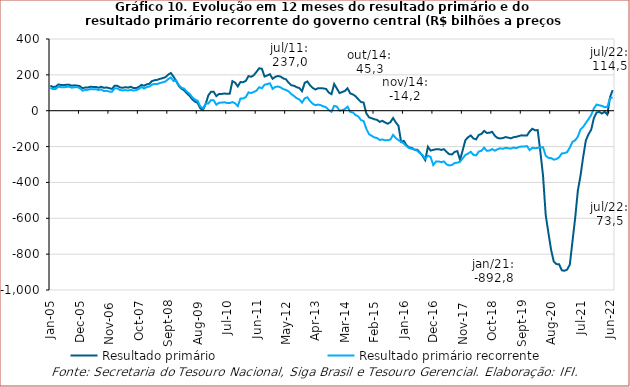
| Category | Resultado primário | Resultado primário recorrente |
|---|---|---|
| 2005-01-01 | 139436.817 | 127673.779 |
| 2005-02-01 | 132611.964 | 120337.511 |
| 2005-03-01 | 133649.316 | 121381.507 |
| 2005-04-01 | 146688.731 | 134319.81 |
| 2005-05-01 | 143333.996 | 131042.146 |
| 2005-06-01 | 142542.541 | 130485.238 |
| 2005-07-01 | 144862.796 | 132820.292 |
| 2005-08-01 | 145155.501 | 134461.936 |
| 2005-09-01 | 139491.511 | 128444.129 |
| 2005-10-01 | 141557.367 | 130928.578 |
| 2005-11-01 | 140064.192 | 131908.505 |
| 2005-12-01 | 137344.642 | 125599.415 |
| 2006-01-01 | 125276.586 | 111679.353 |
| 2006-02-01 | 128983.829 | 115694.97 |
| 2006-03-01 | 129899.632 | 116690.653 |
| 2006-04-01 | 133341.775 | 120479.767 |
| 2006-05-01 | 132758.24 | 120009.68 |
| 2006-06-01 | 132887.423 | 120169.295 |
| 2006-07-01 | 128116.796 | 115333.181 |
| 2006-08-01 | 133942.112 | 119059.597 |
| 2006-09-01 | 127707.337 | 109500.976 |
| 2006-10-01 | 129699.626 | 111447.923 |
| 2006-11-01 | 125626.39 | 106721.613 |
| 2006-12-01 | 121567.73 | 105532.153 |
| 2007-01-01 | 139584.171 | 125148.093 |
| 2007-02-01 | 139056.412 | 124365.782 |
| 2007-03-01 | 130238.918 | 115585.478 |
| 2007-04-01 | 127749.047 | 113198.091 |
| 2007-05-01 | 131350.507 | 115025.716 |
| 2007-06-01 | 128767.824 | 112399.778 |
| 2007-07-01 | 133613.732 | 116794.713 |
| 2007-08-01 | 126768.612 | 112461.109 |
| 2007-09-01 | 125929.982 | 114389.009 |
| 2007-10-01 | 132447.26 | 120627.635 |
| 2007-11-01 | 143927.598 | 132536.48 |
| 2007-12-01 | 139223.904 | 123838.266 |
| 2008-01-01 | 146879.624 | 131829.517 |
| 2008-02-01 | 150495.553 | 135152.38 |
| 2008-03-01 | 165662.895 | 145600.055 |
| 2008-04-01 | 170066.61 | 149521.266 |
| 2008-05-01 | 172512.042 | 149526.183 |
| 2008-06-01 | 177963.956 | 154525.046 |
| 2008-07-01 | 181823.589 | 158520.269 |
| 2008-08-01 | 187166.312 | 162927.95 |
| 2008-09-01 | 200818.945 | 175807.681 |
| 2008-10-01 | 210536.316 | 185662.465 |
| 2008-11-01 | 190063.248 | 165395.837 |
| 2008-12-01 | 164647.302 | 169315.385 |
| 2009-01-01 | 137555.089 | 142496.427 |
| 2009-02-01 | 122995.551 | 128171.68 |
| 2009-03-01 | 112978.877 | 122701.666 |
| 2009-04-01 | 96386.827 | 106142.492 |
| 2009-05-01 | 82927.388 | 94284.544 |
| 2009-06-01 | 63652.812 | 75312.675 |
| 2009-07-01 | 50676.542 | 62349.007 |
| 2009-08-01 | 43877.752 | 55578.905 |
| 2009-09-01 | 13353.323 | 23759.244 |
| 2009-10-01 | 4248.008 | 13230.914 |
| 2009-11-01 | 36811.045 | 39393.355 |
| 2009-12-01 | 85209.783 | 40405.291 |
| 2010-01-01 | 105558.575 | 59141.488 |
| 2010-02-01 | 105524.771 | 58156.271 |
| 2010-03-01 | 81511.102 | 33319.757 |
| 2010-04-01 | 93769.094 | 44527.331 |
| 2010-05-01 | 93364.207 | 45458.046 |
| 2010-06-01 | 95966.377 | 46913.722 |
| 2010-07-01 | 94208.101 | 43394.564 |
| 2010-08-01 | 94885.275 | 42748.288 |
| 2010-09-01 | 164879.63 | 48150.047 |
| 2010-10-01 | 156531.455 | 41463.252 |
| 2010-11-01 | 135577.213 | 25422.679 |
| 2010-12-01 | 159943.242 | 67862.545 |
| 2011-01-01 | 158823.59 | 68735.006 |
| 2011-02-01 | 166284.744 | 75865.08 |
| 2011-03-01 | 193197.364 | 102420.263 |
| 2011-04-01 | 189189.506 | 98325.072 |
| 2011-05-01 | 198210.312 | 104874.406 |
| 2011-06-01 | 217047.095 | 112391.614 |
| 2011-07-01 | 236963.1 | 130921.985 |
| 2011-08-01 | 233879.427 | 125428.407 |
| 2011-09-01 | 190795.578 | 144893.766 |
| 2011-10-01 | 196791.186 | 148575.596 |
| 2011-11-01 | 203769.613 | 152993.558 |
| 2011-12-01 | 178116.682 | 122111.365 |
| 2012-01-01 | 188744.09 | 132459.43 |
| 2012-02-01 | 193775.002 | 135177.613 |
| 2012-03-01 | 190153.501 | 130171.044 |
| 2012-04-01 | 180091.245 | 120091.569 |
| 2012-05-01 | 174989.984 | 116231.498 |
| 2012-06-01 | 156167.208 | 107271.905 |
| 2012-07-01 | 141665.731 | 92458.398 |
| 2012-08-01 | 139319.67 | 82322.014 |
| 2012-09-01 | 131127.406 | 69480.352 |
| 2012-10-01 | 126422.354 | 62437.051 |
| 2012-11-01 | 109041.542 | 45264.456 |
| 2012-12-01 | 155608.216 | 69467.206 |
| 2013-01-01 | 163076.183 | 74710.106 |
| 2013-02-01 | 141330.348 | 53545.207 |
| 2013-03-01 | 126810.93 | 38590.214 |
| 2013-04-01 | 118384.429 | 30413.509 |
| 2013-05-01 | 125280.461 | 34525.796 |
| 2013-06-01 | 125404.575 | 30581.387 |
| 2013-07-01 | 124389.772 | 24204.856 |
| 2013-08-01 | 121283.545 | 18985.257 |
| 2013-09-01 | 101028.985 | 3638.022 |
| 2013-10-01 | 92431.236 | -5953.509 |
| 2013-11-01 | 149128.384 | 26974.292 |
| 2013-12-01 | 123962.716 | 23149.266 |
| 2014-01-01 | 98321 | 642.93 |
| 2014-02-01 | 104544.63 | 3013.354 |
| 2014-03-01 | 110087.822 | 9022.976 |
| 2014-04-01 | 124867.304 | 22670.528 |
| 2014-05-01 | 96579.078 | -6563.368 |
| 2014-06-01 | 90830.137 | -9819.02 |
| 2014-07-01 | 80684.525 | -23925.66 |
| 2014-08-01 | 64059.112 | -32109.408 |
| 2014-09-01 | 48898.162 | -52049.779 |
| 2014-10-01 | 45328.016 | -57829.457 |
| 2014-11-01 | -14200.195 | -100476.094 |
| 2014-12-01 | -36889.767 | -130430.43 |
| 2015-01-01 | -41765.462 | -140080.754 |
| 2015-02-01 | -47713.815 | -148793.64 |
| 2015-03-01 | -50819.747 | -152379.049 |
| 2015-04-01 | -62262.531 | -163022.33 |
| 2015-05-01 | -56413.918 | -160161.047 |
| 2015-06-01 | -65368.949 | -165377.655 |
| 2015-07-01 | -72595.179 | -165027.294 |
| 2015-08-01 | -63810.325 | -160604.092 |
| 2015-09-01 | -40871.626 | -134748.557 |
| 2015-10-01 | -64900.228 | -152532.442 |
| 2015-11-01 | -84113.141 | -163885.709 |
| 2015-12-01 | -173335.463 | -173885.289 |
| 2016-01-01 | -168218.775 | -182513.384 |
| 2016-02-01 | -192257.717 | -197939.581 |
| 2016-03-01 | -204849.273 | -208506.516 |
| 2016-04-01 | -207619.241 | -212721.713 |
| 2016-05-01 | -218091.746 | -215350.086 |
| 2016-06-01 | -218108.598 | -223246.38 |
| 2016-07-01 | -232773.362 | -236786.834 |
| 2016-08-01 | -251838.006 | -247368.038 |
| 2016-09-01 | -275437.505 | -266898.613 |
| 2016-10-01 | -201103.403 | -251472.065 |
| 2016-11-01 | -222244.513 | -257535.614 |
| 2016-12-01 | -218369.819 | -303187.713 |
| 2017-01-01 | -214986.51 | -283544.141 |
| 2017-02-01 | -214607.094 | -282948.174 |
| 2017-03-01 | -218654.874 | -286920.983 |
| 2017-04-01 | -214486.543 | -282837.198 |
| 2017-05-01 | -230093.583 | -299724.289 |
| 2017-06-01 | -243108.369 | -305294.069 |
| 2017-07-01 | -243646.653 | -302469.826 |
| 2017-08-01 | -229523.055 | -291662.916 |
| 2017-09-01 | -225489.857 | -290140.765 |
| 2017-10-01 | -273964.827 | -284301.372 |
| 2017-11-01 | -220512.722 | -265807.491 |
| 2017-12-01 | -164096.421 | -246950.38 |
| 2018-01-01 | -148070.743 | -238796.459 |
| 2018-02-01 | -137872.588 | -229279.817 |
| 2018-03-01 | -154660.132 | -246140.645 |
| 2018-04-01 | -159792.857 | -249525.383 |
| 2018-05-01 | -135081.217 | -227995.19 |
| 2018-06-01 | -129570.344 | -223226.758 |
| 2018-07-01 | -112378.096 | -206092.569 |
| 2018-08-01 | -123945.771 | -223197.543 |
| 2018-09-01 | -122899.43 | -222330.348 |
| 2018-10-01 | -117617.439 | -214008.063 |
| 2018-11-01 | -139686.899 | -223008.615 |
| 2018-12-01 | -152170.644 | -214836.729 |
| 2019-01-01 | -154647.884 | -209515.953 |
| 2019-02-01 | -152483.83 | -212369.124 |
| 2019-03-01 | -146875.095 | -206665.126 |
| 2019-04-01 | -150061.447 | -209316.743 |
| 2019-05-01 | -153999.96 | -211498.364 |
| 2019-06-01 | -147696.495 | -204929.592 |
| 2019-07-01 | -145493.294 | -208921.439 |
| 2019-08-01 | -141189.107 | -202159.005 |
| 2019-09-01 | -137239.581 | -199546.976 |
| 2019-10-01 | -138545.895 | -200071.326 |
| 2019-11-01 | -138332.414 | -197319.433 |
| 2019-12-01 | -116063.429 | -219610.569 |
| 2020-01-01 | -100616.364 | -207074.477 |
| 2020-02-01 | -108889.965 | -209180.643 |
| 2020-03-01 | -108107.522 | -207408.038 |
| 2020-04-01 | -227982.532 | -205073.303 |
| 2020-05-01 | -362719 | -203780.097 |
| 2020-06-01 | -582808.174 | -250758.139 |
| 2020-07-01 | -680961.774 | -262975.563 |
| 2020-08-01 | -775318.466 | -264307.932 |
| 2020-09-01 | -840761.533 | -273121.714 |
| 2020-10-01 | -855432.163 | -269587.775 |
| 2020-11-01 | -856563.83 | -259772.287 |
| 2020-12-01 | -889813.231 | -238239.362 |
| 2021-01-01 | -892849.754 | -237039.735 |
| 2021-02-01 | -886163.514 | -230467.213 |
| 2021-03-01 | -858527.824 | -205722.357 |
| 2021-04-01 | -727924.868 | -173553.002 |
| 2021-05-01 | -598469.945 | -165113.356 |
| 2021-06-01 | -445512.626 | -144450.684 |
| 2021-07-01 | -361560.679 | -104989.575 |
| 2021-08-01 | -256479.036 | -90178.874 |
| 2021-09-01 | -165290.796 | -67581.773 |
| 2021-10-01 | -130915.357 | -46612.557 |
| 2021-11-01 | -105159.055 | -23447.971 |
| 2021-12-01 | -39780.598 | 13583.171 |
| 2022-01-01 | -10045.714 | 34519.649 |
| 2022-02-01 | -6987.906 | 30067.003 |
| 2022-03-01 | -15691.627 | 26838.945 |
| 2022-04-01 | -5417.855 | 19931.142 |
| 2022-05-01 | -21355.77 | 20359.718 |
| 2022-06-01 | 74627.849 | 69543.478 |
| 2022-07-01 | 114471.982 | 73518.715 |